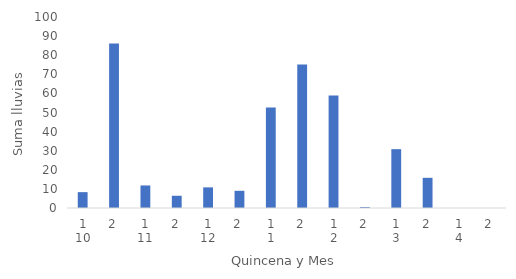
| Category | Series 0 |
|---|---|
| 0 | 8.3 |
| 1 | 86.1 |
| 2 | 11.8 |
| 3 | 6.4 |
| 4 | 10.8 |
| 5 | 9 |
| 6 | 52.6 |
| 7 | 75.1 |
| 8 | 58.9 |
| 9 | 0.5 |
| 10 | 30.8 |
| 11 | 15.8 |
| 12 | 0 |
| 13 | 0 |